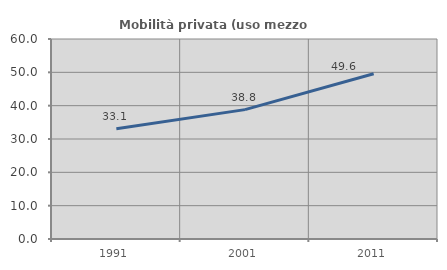
| Category | Mobilità privata (uso mezzo privato) |
|---|---|
| 1991.0 | 33.097 |
| 2001.0 | 38.811 |
| 2011.0 | 49.589 |